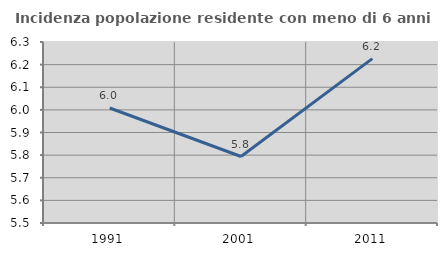
| Category | Incidenza popolazione residente con meno di 6 anni |
|---|---|
| 1991.0 | 6.008 |
| 2001.0 | 5.794 |
| 2011.0 | 6.227 |